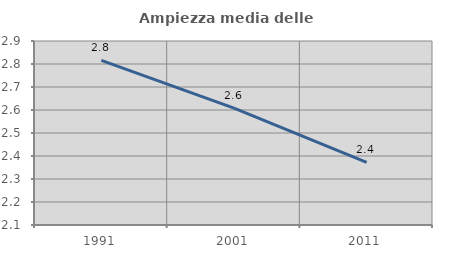
| Category | Ampiezza media delle famiglie |
|---|---|
| 1991.0 | 2.816 |
| 2001.0 | 2.608 |
| 2011.0 | 2.372 |